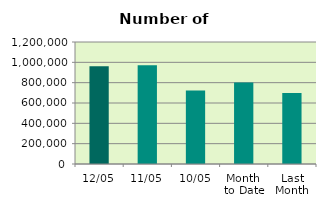
| Category | Series 0 |
|---|---|
| 12/05 | 960436 |
| 11/05 | 970594 |
| 10/05 | 722732 |
| Month 
to Date | 801748.5 |
| Last
Month | 699227 |